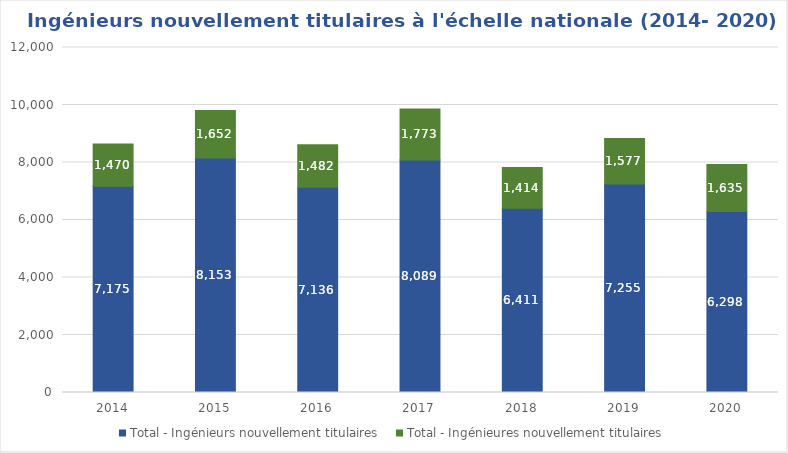
| Category | Total - Ingénieurs nouvellement titulaires | Total - Ingénieures nouvellement titulaires |
|---|---|---|
| 2014.0 | 7175 | 1470 |
| 2015.0 | 8153 | 1652 |
| 2016.0 | 7136 | 1482 |
| 2017.0 | 8089 | 1773 |
| 2018.0 | 6411 | 1414 |
| 2019.0 | 7255 | 1577 |
| 2020.0 | 6298 | 1635 |